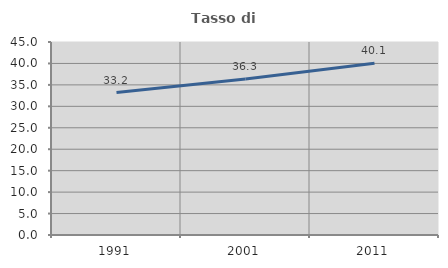
| Category | Tasso di occupazione   |
|---|---|
| 1991.0 | 33.211 |
| 2001.0 | 36.35 |
| 2011.0 | 40.062 |